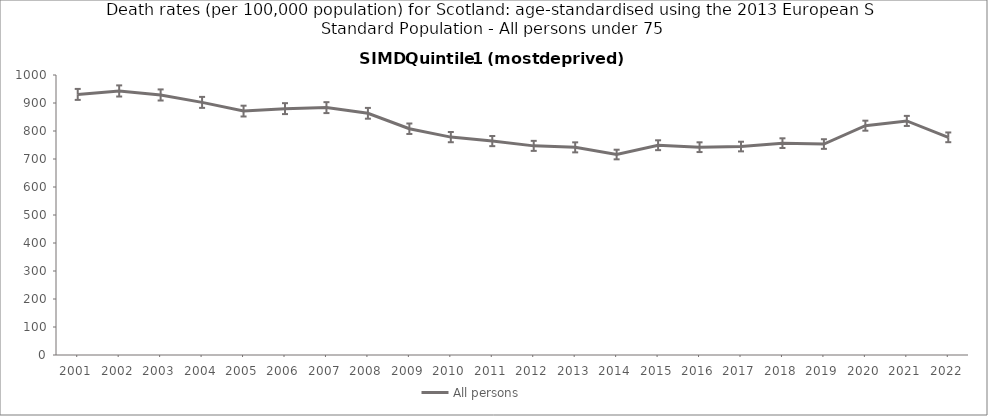
| Category | All persons |
|---|---|
| 2001.0 | 930.7 |
| 2002.0 | 943 |
| 2003.0 | 928.7 |
| 2004.0 | 902.2 |
| 2005.0 | 871.1 |
| 2006.0 | 879.9 |
| 2007.0 | 883.5 |
| 2008.0 | 863.2 |
| 2009.0 | 808.1 |
| 2010.0 | 778.2 |
| 2011.0 | 764 |
| 2012.0 | 746.9 |
| 2013.0 | 741.6 |
| 2014.0 | 716 |
| 2015.0 | 749.2 |
| 2016.0 | 742.2 |
| 2017.0 | 744.5 |
| 2018.0 | 756.6 |
| 2019.0 | 753.4 |
| 2020.0 | 819 |
| 2021.0 | 836 |
| 2022.0 | 777.4 |